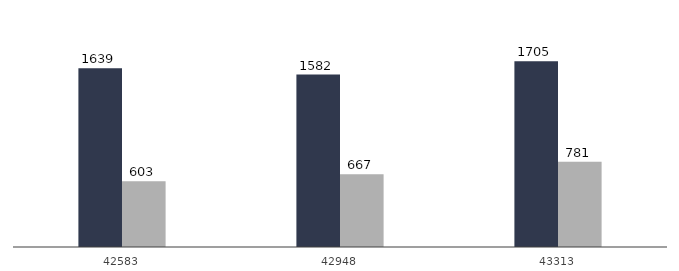
| Category |  Gemeldete Bewerber für Berufsausbildungsstellen |  Gemeldete Berufsausbildungsstellen |
|---|---|---|
| 42583 | 1639 | 603 |
| 42948 | 1582 | 667 |
| 43313 | 1705 | 781 |